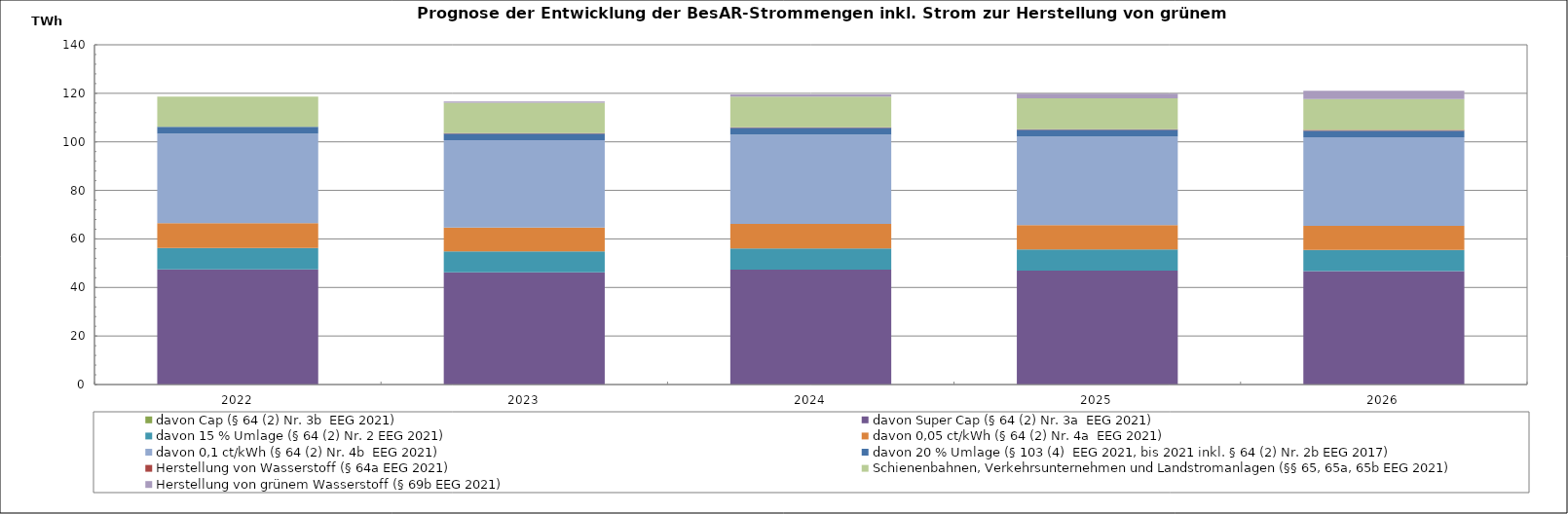
| Category | davon Cap (§ 64 (2) Nr. 3b  EEG 2021) | davon Super Cap (§ 64 (2) Nr. 3a  EEG 2021) | davon 15 % Umlage (§ 64 (2) Nr. 2 EEG 2021) | davon 0,05 ct/kWh (§ 64 (2) Nr. 4a  EEG 2021) | davon 0,1 ct/kWh (§ 64 (2) Nr. 4b  EEG 2021) | davon 20 % Umlage (§ 103 (4)  EEG 2021, bis 2021 inkl. § 64 (2) Nr. 2b EEG 2017) | Herstellung von Wasserstoff (§ 64a EEG 2021) | Schienenbahnen, Verkehrsunternehmen und Landstromanlagen (§§ 65, 65a, 65b EEG 2021) | Herstellung von grünem Wasserstoff (§ 69b EEG 2021) |
|---|---|---|---|---|---|---|---|---|---|
| 2022.0 | 0 | 47.483 | 8.827 | 10.159 | 36.935 | 2.802 | 0.001 | 12.409 | 0 |
| 2023.0 | 0 | 46.232 | 8.592 | 9.905 | 35.977 | 2.726 | 0.18 | 12.557 | 0.42 |
| 2024.0 | 0 | 47.296 | 8.794 | 10.105 | 36.814 | 2.795 | 0.187 | 12.646 | 0.913 |
| 2025.0 | 0 | 46.904 | 8.722 | 10.014 | 36.543 | 2.774 | 0.199 | 12.75 | 1.9 |
| 2026.0 | 0 | 46.741 | 8.694 | 9.969 | 36.467 | 2.768 | 0.216 | 12.828 | 3.384 |